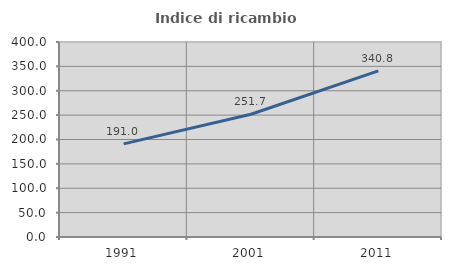
| Category | Indice di ricambio occupazionale  |
|---|---|
| 1991.0 | 191.026 |
| 2001.0 | 251.724 |
| 2011.0 | 340.816 |